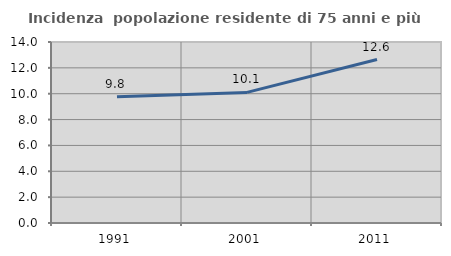
| Category | Incidenza  popolazione residente di 75 anni e più |
|---|---|
| 1991.0 | 9.758 |
| 2001.0 | 10.102 |
| 2011.0 | 12.644 |